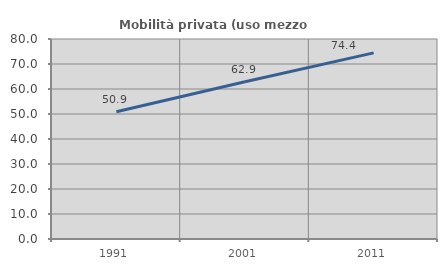
| Category | Mobilità privata (uso mezzo privato) |
|---|---|
| 1991.0 | 50.932 |
| 2001.0 | 62.92 |
| 2011.0 | 74.439 |